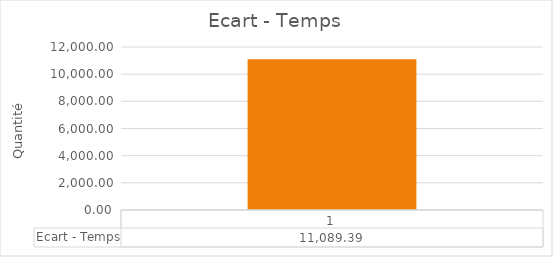
| Category | Ecart - Temps |
|---|---|
| 0 | 11089.39 |